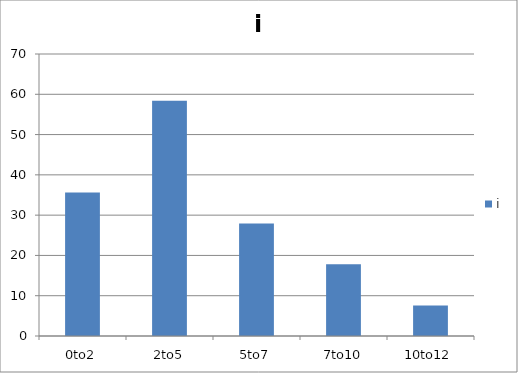
| Category | i |
|---|---|
| 0to2 | 35.6 |
| 2to5 | 58.4 |
| 5to7 | 27.9 |
| 7to10 | 17.8 |
| 10to12 | 7.6 |